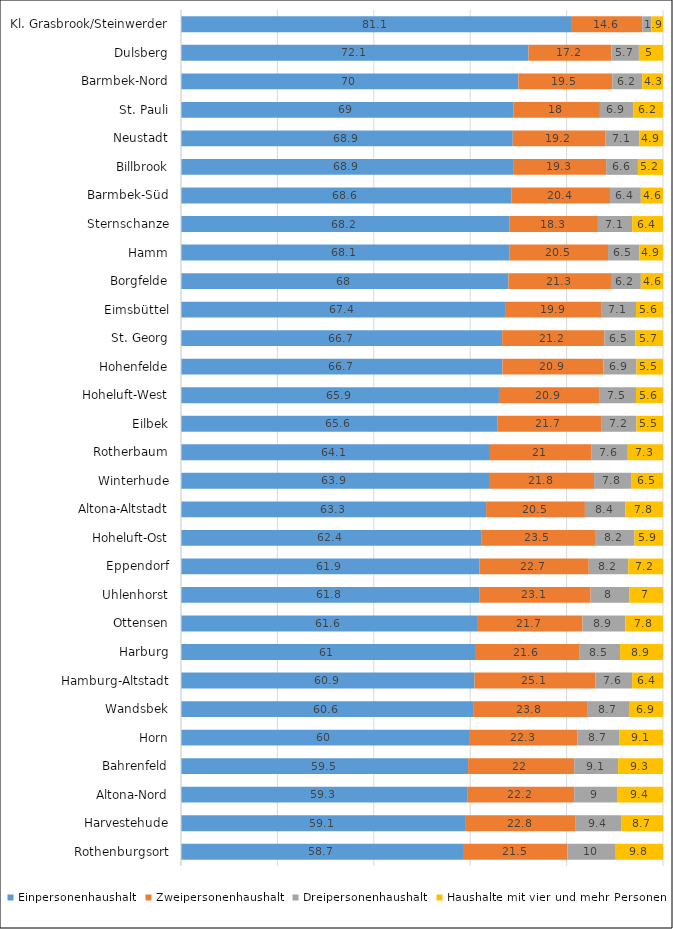
| Category | Einpersonenhaushalt | Zweipersonenhaushalt | Dreipersonenhaushalt | Haushalte mit vier und mehr Personen  |
|---|---|---|---|---|
| Kl. Grasbrook/Steinwerder | 81.1 | 14.6 | 1.9 | 2.4 |
| Dulsberg | 72.1 | 17.2 | 5.7 | 5 |
| Barmbek-Nord | 70 | 19.5 | 6.2 | 4.3 |
| St. Pauli | 69 | 18 | 6.9 | 6.2 |
| Neustadt | 68.9 | 19.2 | 7.1 | 4.9 |
| Billbrook | 68.9 | 19.3 | 6.6 | 5.2 |
| Barmbek-Süd | 68.6 | 20.4 | 6.4 | 4.6 |
| Sternschanze | 68.2 | 18.3 | 7.1 | 6.4 |
| Hamm | 68.1 | 20.5 | 6.5 | 4.9 |
| Borgfelde | 68 | 21.3 | 6.2 | 4.6 |
| Eimsbüttel | 67.4 | 19.9 | 7.1 | 5.6 |
| St. Georg | 66.7 | 21.2 | 6.5 | 5.7 |
| Hohenfelde | 66.7 | 20.9 | 6.9 | 5.5 |
| Hoheluft-West | 65.9 | 20.9 | 7.5 | 5.6 |
| Eilbek | 65.6 | 21.7 | 7.2 | 5.5 |
| Rotherbaum | 64.1 | 21 | 7.6 | 7.3 |
| Winterhude | 63.9 | 21.8 | 7.8 | 6.5 |
| Altona-Altstadt | 63.3 | 20.5 | 8.4 | 7.8 |
| Hoheluft-Ost | 62.4 | 23.5 | 8.2 | 5.9 |
| Eppendorf | 61.9 | 22.7 | 8.2 | 7.2 |
| Uhlenhorst | 61.8 | 23.1 | 8 | 7 |
| Ottensen | 61.6 | 21.7 | 8.9 | 7.8 |
| Harburg | 61 | 21.6 | 8.5 | 8.9 |
| Hamburg-Altstadt | 60.9 | 25.1 | 7.6 | 6.4 |
| Wandsbek | 60.6 | 23.8 | 8.7 | 6.9 |
| Horn | 60 | 22.3 | 8.7 | 9.1 |
| Bahrenfeld | 59.5 | 22 | 9.1 | 9.3 |
| Altona-Nord | 59.3 | 22.2 | 9 | 9.4 |
| Harvestehude | 59.1 | 22.8 | 9.4 | 8.7 |
| Rothenburgsort | 58.7 | 21.5 | 10 | 9.8 |